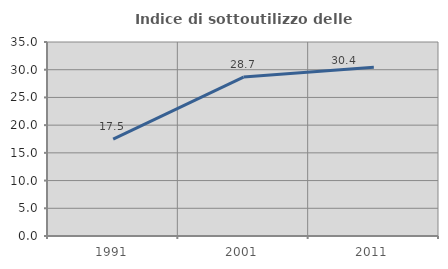
| Category | Indice di sottoutilizzo delle abitazioni  |
|---|---|
| 1991.0 | 17.491 |
| 2001.0 | 28.67 |
| 2011.0 | 30.435 |